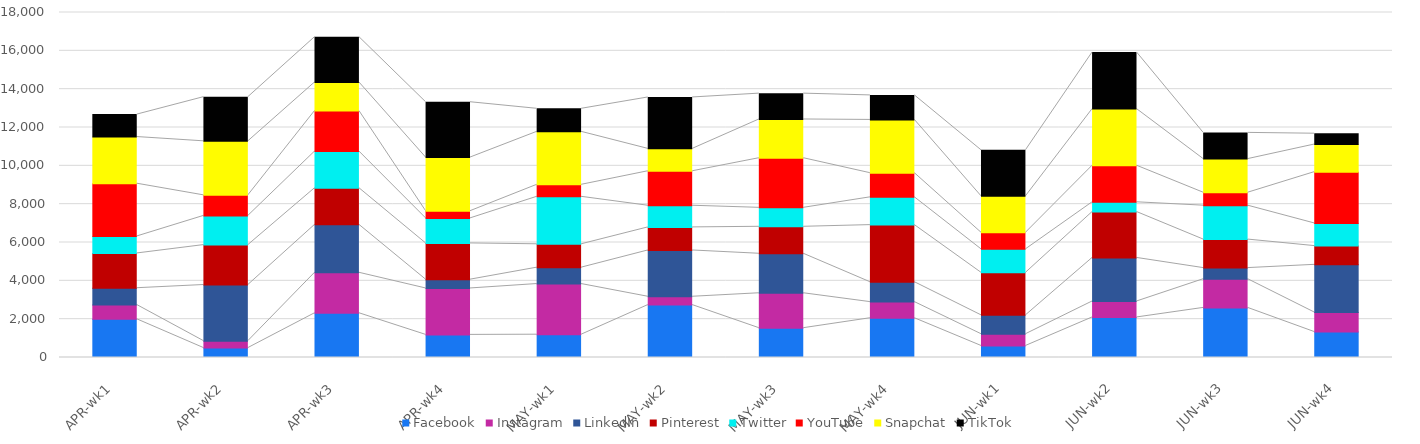
| Category | Facebook | Instagram | LinkedIn | Pinterest | Twitter | YouTube | Snapchat | TikTok |
|---|---|---|---|---|---|---|---|---|
| APR-wk1 | 1992 | 744 | 879 | 1814 | 887 | 2751 | 2435 | 1171 |
| APR-wk2 | 492 | 362 | 2928 | 2083 | 1523 | 1072 | 2819 | 2304 |
| APR-wk3 | 2308 | 2112 | 2500 | 1912 | 1913 | 2115 | 1490 | 2363 |
| APR-wk4 | 1179 | 2423 | 459 | 1891 | 1306 | 376 | 2798 | 2887 |
| MAY-wk1 | 1190 | 2643 | 854 | 1220 | 2477 | 625 | 2765 | 1201 |
| MAY-wk2 | 2735 | 434 | 2416 | 1203 | 1130 | 1799 | 1168 | 2682 |
| MAY-wk3 | 1530 | 1822 | 2061 | 1407 | 989 | 2589 | 2021 | 1348 |
| MAY-wk4 | 2048 | 842 | 1038 | 2980 | 1448 | 1261 | 2778 | 1279 |
| JUN-wk1 | 602 | 613 | 984 | 2219 | 1225 | 865 | 1902 | 2400 |
| JUN-wk2 | 2090 | 833 | 2272 | 2395 | 508 | 1908 | 2954 | 2956 |
| JUN-wk3 | 2588 | 1497 | 580 | 1488 | 1769 | 675 | 1754 | 1368 |
| JUN-wk4 | 1327 | 1019 | 2489 | 978 | 1181 | 2677 | 1441 | 564 |